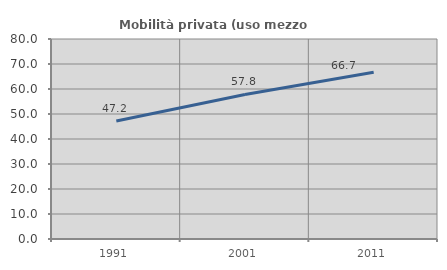
| Category | Mobilità privata (uso mezzo privato) |
|---|---|
| 1991.0 | 47.204 |
| 2001.0 | 57.812 |
| 2011.0 | 66.728 |